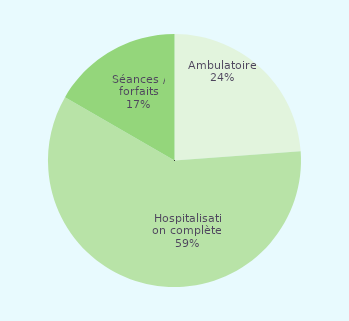
| Category | Series 0 |
|---|---|
| Ambulatoire  | 0.276 |
| Hospitalisation complète  | 0.689 |
| Séances / forfaits | 0.193 |